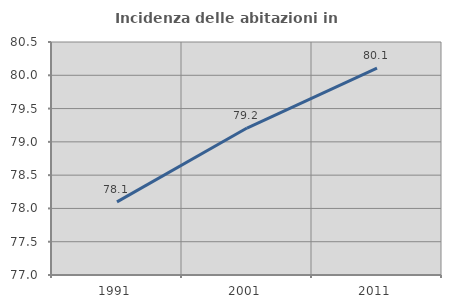
| Category | Incidenza delle abitazioni in proprietà  |
|---|---|
| 1991.0 | 78.099 |
| 2001.0 | 79.208 |
| 2011.0 | 80.108 |